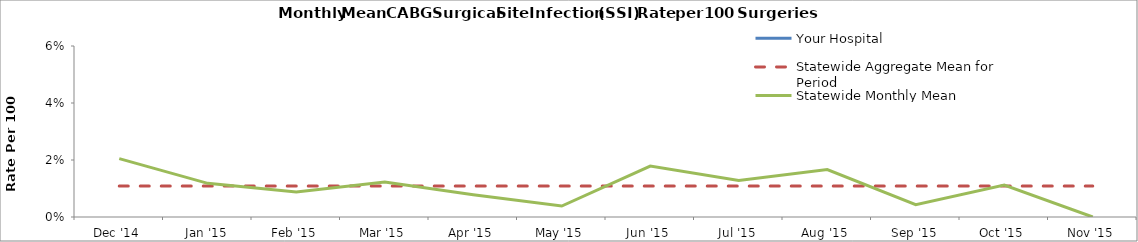
| Category | Your Hospital | Statewide Aggregate Mean for Period | Statewide Monthly Mean |
|---|---|---|---|
| Dec '14 |  | 0.011 | 0.02 |
| Jan '15 |  | 0.011 | 0.012 |
| Feb '15 |  | 0.011 | 0.009 |
| Mar '15 |  | 0.011 | 0.012 |
| Apr '15 |  | 0.011 | 0.008 |
| May '15 |  | 0.011 | 0.004 |
| Jun '15 |  | 0.011 | 0.018 |
| Jul '15 |  | 0.011 | 0.013 |
| Aug '15 |  | 0.011 | 0.017 |
| Sep '15 |  | 0.011 | 0.004 |
| Oct '15 |  | 0.011 | 0.011 |
| Nov '15 |  | 0.011 | 0 |